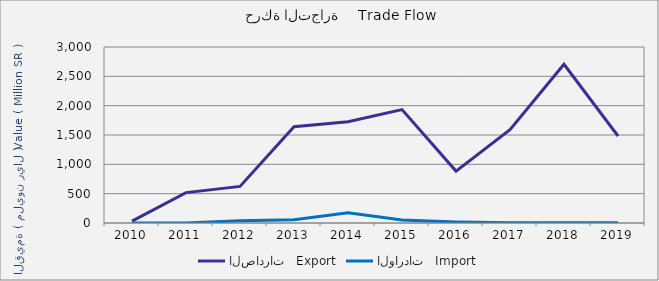
| Category | الصادرات   Export | الواردات   Import |
|---|---|---|
| 2010.0 | 30681022 | 353399 |
| 2011.0 | 517617757 | 405068 |
| 2012.0 | 623808435 | 36604258 |
| 2013.0 | 1641427891 | 55024951 |
| 2014.0 | 1726522430 | 172734146 |
| 2015.0 | 1933151100 | 49835238 |
| 2016.0 | 884971518 | 18751290 |
| 2017.0 | 1591424329 | 2244028 |
| 2018.0 | 2706209011 | 4185321 |
| 2019.0 | 1482655536 | 5819396 |